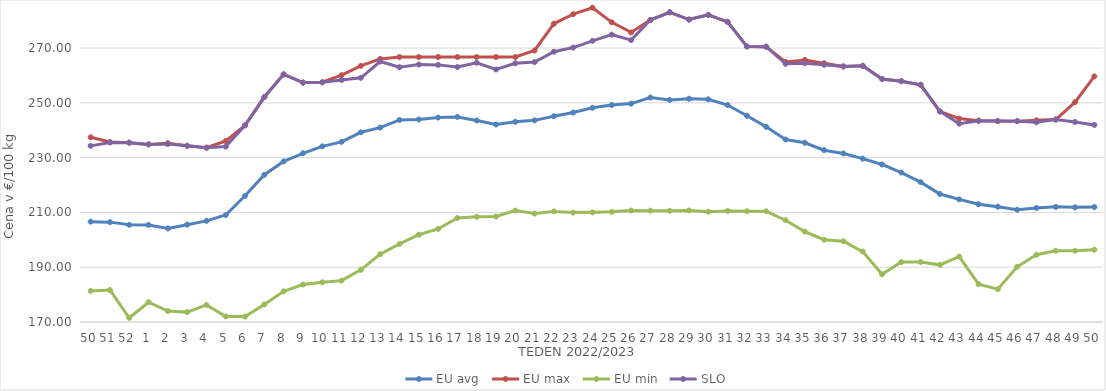
| Category | EU avg | EU max | EU min | SLO |
|---|---|---|---|---|
| 50.0 | 206.632 | 237.432 | 181.34 | 234.3 |
| 51.0 | 206.459 | 235.69 | 181.65 | 235.54 |
| 52.0 | 205.464 | 235.46 | 171.5 | 235.46 |
| 1.0 | 205.441 | 234.84 | 177.21 | 234.84 |
| 2.0 | 204.155 | 235.3 | 174 | 234.97 |
| 3.0 | 205.538 | 234.32 | 173.61 | 234.32 |
| 4.0 | 206.918 | 233.64 | 176.242 | 233.64 |
| 5.0 | 209.058 | 236.08 | 172.035 | 234.03 |
| 6.0 | 216.062 | 241.8 | 171.97 | 241.8 |
| 7.0 | 223.766 | 252.13 | 176.417 | 252.13 |
| 8.0 | 228.632 | 260.41 | 181.197 | 260.41 |
| 9.0 | 231.598 | 257.4 | 183.673 | 257.4 |
| 10.0 | 234.131 | 257.52 | 184.492 | 257.52 |
| 11.0 | 235.766 | 260.12 | 185.095 | 258.36 |
| 12.0 | 239.262 | 263.51 | 189.045 | 259.14 |
| 13.0 | 240.972 | 266.04 | 194.771 | 265.1 |
| 14.0 | 243.779 | 266.74 | 198.512 | 263.04 |
| 15.0 | 243.938 | 266.74 | 201.856 | 264 |
| 16.0 | 244.633 | 266.74 | 203.974 | 263.87 |
| 17.0 | 244.863 | 266.74 | 207.96 | 263.07 |
| 18.0 | 243.563 | 266.74 | 208.405 | 264.65 |
| 19.0 | 242.122 | 266.74 | 208.515 | 262.21 |
| 20.0 | 243.092 | 266.74 | 210.67 | 264.46 |
| 21.0 | 243.615 | 269.134 | 209.574 | 264.89 |
| 22.0 | 245.131 | 278.889 | 210.376 | 268.67 |
| 23.0 | 246.464 | 282.38 | 209.946 | 270.19 |
| 24.0 | 248.202 | 284.74 | 210.022 | 272.66 |
| 25.0 | 249.228 | 279.396 | 210.23 | 274.9 |
| 26.0 | 249.731 | 275.73 | 210.681 | 272.9 |
| 27.0 | 251.97 | 280.27 | 210.634 | 280.27 |
| 28.0 | 251.068 | 283.06 | 210.575 | 283.06 |
| 29.0 | 251.51 | 280.42 | 210.727 | 280.42 |
| 30.0 | 251.282 | 282.11 | 210.285 | 282.11 |
| 31.0 | 249.211 | 279.55 | 210.549 | 279.55 |
| 32.0 | 245.312 | 270.6 | 210.435 | 270.6 |
| 33.0 | 241.247 | 270.5 | 210.425 | 270.5 |
| 34.0 | 236.645 | 264.923 | 207.162 | 264.26 |
| 35.0 | 235.426 | 265.67 | 203 | 264.5 |
| 36.0 | 232.731 | 264.471 | 200.03 | 263.92 |
| 37.0 | 231.527 | 263.3 | 199.49 | 263.3 |
| 38.0 | 229.643 | 263.54 | 195.702 | 263.54 |
| 39.0 | 227.514 | 258.72 | 187.46 | 258.72 |
| 40.0 | 224.557 | 257.92 | 191.876 | 257.92 |
| 41.0 | 221.066 | 256.61 | 191.895 | 256.61 |
| 42.0 | 216.719 | 246.86 | 190.863 | 246.86 |
| 43.0 | 214.76 | 244.27 | 193.875 | 242.38 |
| 44.0 | 212.982 | 243.49 | 183.8 | 243.49 |
| 45.0 | 212.092 | 243.34 | 181.98 | 243.34 |
| 46.0 | 210.986 | 243.33 | 190.15 | 243.33 |
| 47.0 | 211.624 | 243.62 | 194.54 | 242.9 |
| 48.0 | 212.03 | 243.9 | 196 | 243.9 |
| 49.0 | 211.859 | 250.269 | 196 | 243.02 |
| 50.0 | 211.964 | 259.67 | 196.38 | 241.94 |